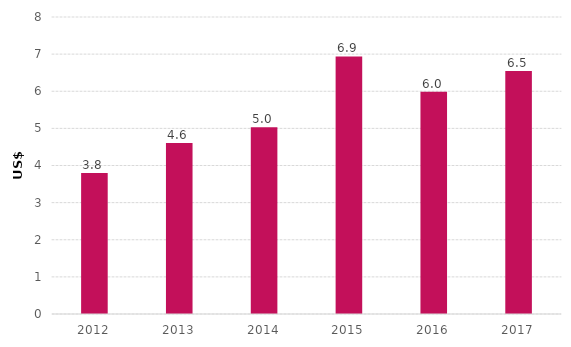
| Category | US$ billions |
|---|---|
| 2012.0 | 3.8 |
| 2013.0 | 4.604 |
| 2014.0 | 5.028 |
| 2015.0 | 6.936 |
| 2016.0 | 5.99 |
| 2017.0 | 6.547 |